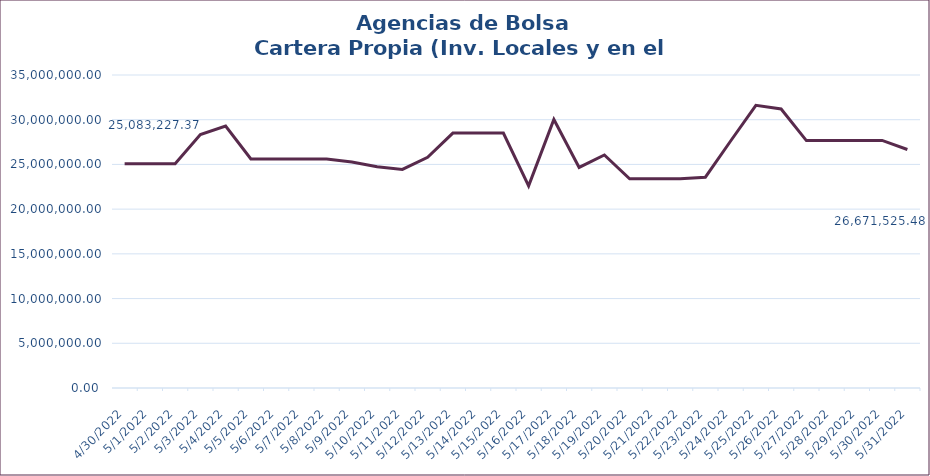
| Category | TOTAL |
|---|---|
| 4/30/22 | 25083227.37 |
| 5/1/22 | 25085698.8 |
| 5/2/22 | 25088183.13 |
| 5/3/22 | 28334358.55 |
| 5/4/22 | 29299908.15 |
| 5/5/22 | 25617890.66 |
| 5/6/22 | 25606149.74 |
| 5/7/22 | 25608788.71 |
| 5/8/22 | 25611465.84 |
| 5/9/22 | 25281875.47 |
| 5/10/22 | 24747334.41 |
| 5/11/22 | 24439476.54 |
| 5/12/22 | 25795170.52 |
| 5/13/22 | 28508465.31 |
| 5/14/22 | 28511454.09 |
| 5/15/22 | 28514406.4 |
| 5/16/22 | 22601962.04 |
| 5/17/22 | 30030800.9 |
| 5/18/22 | 24663313.57 |
| 5/19/22 | 26054763.78 |
| 5/20/22 | 23392349.02 |
| 5/21/22 | 23394680.53 |
| 5/22/22 | 23397036.97 |
| 5/23/22 | 23572992.12 |
| 5/24/22 | 27618132.03 |
| 5/25/22 | 31606973.07 |
| 5/26/22 | 31202183.78 |
| 5/27/22 | 27664891.32 |
| 5/28/22 | 27667477.97 |
| 5/29/22 | 27670072.01 |
| 5/30/22 | 27686164.35 |
| 5/31/22 | 26671525.48 |